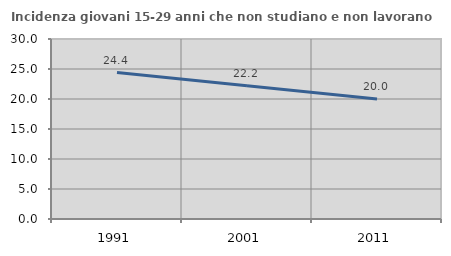
| Category | Incidenza giovani 15-29 anni che non studiano e non lavorano  |
|---|---|
| 1991.0 | 24.401 |
| 2001.0 | 22.222 |
| 2011.0 | 20 |